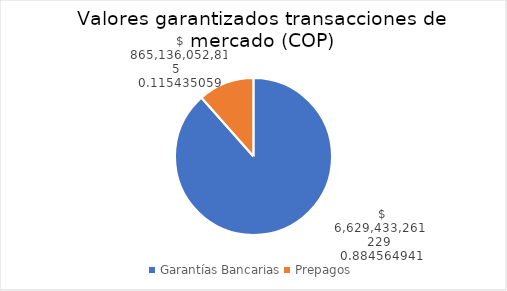
| Category | Garantías Bancarias |
|---|---|
| Garantías Bancarias | 6629433261228.529 |
| Prepagos  | 865136052815.46 |